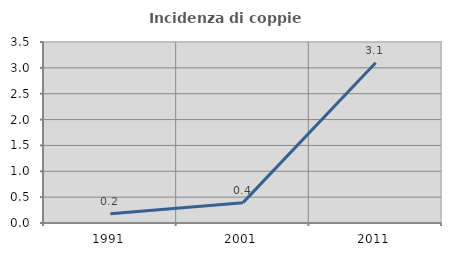
| Category | Incidenza di coppie miste |
|---|---|
| 1991.0 | 0.178 |
| 2001.0 | 0.393 |
| 2011.0 | 3.099 |